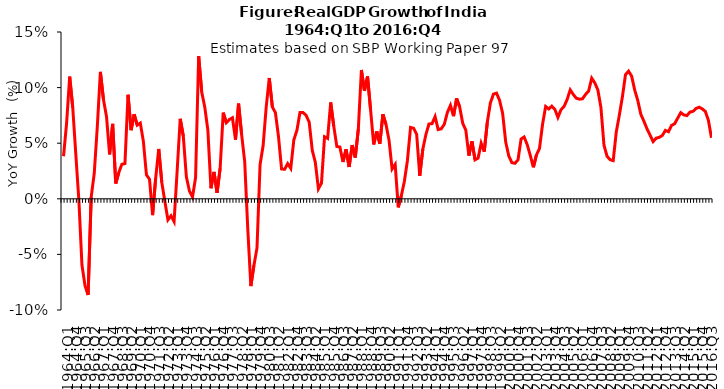
| Category | Series 0 |
|---|---|
| 1964:Q1 | 0.038 |
| 1964:Q2 | 0.068 |
| 1964:Q3 | 0.11 |
| 1964:Q4 | 0.082 |
| 1965:Q1 | 0.04 |
| 1965:Q2 | -0.002 |
| 1965:Q3 | -0.06 |
| 1965:Q4 | -0.078 |
| 1966:Q1 | -0.087 |
| 1966:Q2 | 0.001 |
| 1966:Q3 | 0.023 |
| 1966:Q4 | 0.065 |
| 1967:Q1 | 0.114 |
| 1967:Q2 | 0.089 |
| 1967:Q3 | 0.074 |
| 1967:Q4 | 0.04 |
| 1968:Q1 | 0.067 |
| 1968:Q2 | 0.014 |
| 1968:Q3 | 0.024 |
| 1968:Q4 | 0.031 |
| 1969:Q1 | 0.032 |
| 1969:Q2 | 0.094 |
| 1969:Q3 | 0.062 |
| 1969:Q4 | 0.076 |
| 1970:Q1 | 0.066 |
| 1970:Q2 | 0.068 |
| 1970:Q3 | 0.052 |
| 1970:Q4 | 0.021 |
| 1971:Q1 | 0.018 |
| 1971:Q2 | -0.015 |
| 1971:Q3 | 0.018 |
| 1971:Q4 | 0.045 |
| 1972:Q1 | 0.015 |
| 1972:Q2 | -0.002 |
| 1972:Q3 | -0.019 |
| 1972:Q4 | -0.015 |
| 1973:Q1 | -0.02 |
| 1973:Q2 | 0.025 |
| 1973:Q3 | 0.072 |
| 1973:Q4 | 0.056 |
| 1974:Q1 | 0.02 |
| 1974:Q2 | 0.007 |
| 1974:Q3 | 0.002 |
| 1974:Q4 | 0.019 |
| 1975:Q1 | 0.128 |
| 1975:Q2 | 0.096 |
| 1975:Q3 | 0.082 |
| 1975:Q4 | 0.062 |
| 1976:Q1 | 0.01 |
| 1976:Q2 | 0.024 |
| 1976:Q3 | 0.005 |
| 1976:Q4 | 0.027 |
| 1977:Q1 | 0.077 |
| 1977:Q2 | 0.068 |
| 1977:Q3 | 0.071 |
| 1977:Q4 | 0.073 |
| 1978:Q1 | 0.053 |
| 1978:Q2 | 0.086 |
| 1978:Q3 | 0.058 |
| 1978:Q4 | 0.033 |
| 1979:Q1 | -0.027 |
| 1979:Q2 | -0.078 |
| 1979:Q3 | -0.06 |
| 1979:Q4 | -0.044 |
| 1980:Q1 | 0.031 |
| 1980:Q2 | 0.048 |
| 1980:Q3 | 0.083 |
| 1980:Q4 | 0.109 |
| 1981:Q1 | 0.083 |
| 1981:Q2 | 0.077 |
| 1981:Q3 | 0.056 |
| 1981:Q4 | 0.027 |
| 1982:Q1 | 0.027 |
| 1982:Q2 | 0.032 |
| 1982:Q3 | 0.027 |
| 1982:Q4 | 0.053 |
| 1983:Q1 | 0.061 |
| 1983:Q2 | 0.078 |
| 1983:Q3 | 0.078 |
| 1983:Q4 | 0.075 |
| 1984:Q1 | 0.069 |
| 1984:Q2 | 0.044 |
| 1984:Q3 | 0.033 |
| 1984:Q4 | 0.009 |
| 1985:Q1 | 0.014 |
| 1985:Q2 | 0.056 |
| 1985:Q3 | 0.054 |
| 1985:Q4 | 0.087 |
| 1986:Q1 | 0.065 |
| 1986:Q2 | 0.047 |
| 1986:Q3 | 0.046 |
| 1986:Q4 | 0.033 |
| 1987:Q1 | 0.045 |
| 1987:Q2 | 0.029 |
| 1987:Q3 | 0.048 |
| 1987:Q4 | 0.037 |
| 1988:Q1 | 0.063 |
| 1988:Q2 | 0.116 |
| 1988:Q3 | 0.097 |
| 1988:Q4 | 0.11 |
| 1989:Q1 | 0.08 |
| 1989:Q2 | 0.049 |
| 1989:Q3 | 0.061 |
| 1989:Q4 | 0.049 |
| 1990:Q1 | 0.076 |
| 1990:Q2 | 0.067 |
| 1990:Q3 | 0.053 |
| 1990:Q4 | 0.027 |
| 1991:Q1 | 0.031 |
| 1991:Q2 | -0.008 |
| 1991:Q3 | 0.003 |
| 1991:Q4 | 0.016 |
| 1992:Q1 | 0.035 |
| 1992:Q2 | 0.064 |
| 1992:Q3 | 0.064 |
| 1992:Q4 | 0.058 |
| 1993:Q1 | 0.021 |
| 1993:Q2 | 0.045 |
| 1993:Q3 | 0.058 |
| 1993:Q4 | 0.067 |
| 1994:Q1 | 0.068 |
| 1994:Q2 | 0.074 |
| 1994:Q3 | 0.062 |
| 1994:Q4 | 0.063 |
| 1995:Q1 | 0.067 |
| 1995:Q2 | 0.078 |
| 1995:Q3 | 0.084 |
| 1995:Q4 | 0.074 |
| 1996:Q1 | 0.09 |
| 1996:Q2 | 0.083 |
| 1996:Q3 | 0.068 |
| 1996:Q4 | 0.062 |
| 1997:Q1 | 0.039 |
| 1997:Q2 | 0.052 |
| 1997:Q3 | 0.035 |
| 1997:Q4 | 0.037 |
| 1998:Q1 | 0.05 |
| 1998:Q2 | 0.042 |
| 1998:Q3 | 0.069 |
| 1998:Q4 | 0.086 |
| 1999:Q1 | 0.094 |
| 1999:Q2 | 0.095 |
| 1999:Q3 | 0.089 |
| 1999:Q4 | 0.077 |
| 2000:Q1 | 0.051 |
| 2000:Q2 | 0.038 |
| 2000:Q3 | 0.033 |
| 2000:Q4 | 0.032 |
| 2001:Q1 | 0.035 |
| 2001:Q2 | 0.054 |
| 2001:Q3 | 0.056 |
| 2001:Q4 | 0.049 |
| 2002:Q1 | 0.039 |
| 2002:Q2 | 0.028 |
| 2002:Q3 | 0.039 |
| 2002:Q4 | 0.045 |
| 2003:Q1 | 0.067 |
| 2003:Q2 | 0.083 |
| 2003:Q3 | 0.081 |
| 2003:Q4 | 0.083 |
| 2004:Q1 | 0.08 |
| 2004:Q2 | 0.073 |
| 2004:Q3 | 0.08 |
| 2004:Q4 | 0.083 |
| 2005:Q1 | 0.089 |
| 2005:Q2 | 0.098 |
| 2005:Q3 | 0.094 |
| 2005:Q4 | 0.09 |
| 2006:Q1 | 0.09 |
| 2006:Q2 | 0.09 |
| 2006:Q3 | 0.094 |
| 2006:Q4 | 0.097 |
| 2007:Q1 | 0.108 |
| 2007:Q2 | 0.104 |
| 2007:Q3 | 0.098 |
| 2007:Q4 | 0.082 |
| 2008:Q1 | 0.048 |
| 2008:Q2 | 0.038 |
| 2008:Q3 | 0.035 |
| 2008:Q4 | 0.034 |
| 2009:Q1 | 0.06 |
| 2009:Q2 | 0.075 |
| 2009:Q3 | 0.092 |
| 2009:Q4 | 0.112 |
| 2010:Q1 | 0.115 |
| 2010:Q2 | 0.11 |
| 2010:Q3 | 0.098 |
| 2010:Q4 | 0.088 |
| 2011:Q1 | 0.076 |
| 2011:Q2 | 0.07 |
| 2011:Q3 | 0.063 |
| 2011:Q4 | 0.057 |
| 2012:Q1 | 0.051 |
| 2012:Q2 | 0.055 |
| 2012:Q3 | 0.055 |
| 2012:Q4 | 0.057 |
| 2013:Q1 | 0.062 |
| 2013:Q2 | 0.06 |
| 2013:Q3 | 0.066 |
| 2013:Q4 | 0.067 |
| 2014:Q1 | 0.073 |
| 2014:Q2 | 0.077 |
| 2014:Q3 | 0.075 |
| 2014:Q4 | 0.075 |
| 2015:Q1 | 0.078 |
| 2015:Q2 | 0.079 |
| 2015:Q3 | 0.081 |
| 2015:Q4 | 0.082 |
| 2016:Q1 | 0.081 |
| 2016:Q2 | 0.079 |
| 2016:Q3 | 0.071 |
| 2016:Q4 | 0.055 |